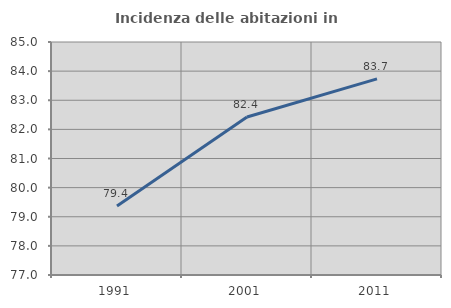
| Category | Incidenza delle abitazioni in proprietà  |
|---|---|
| 1991.0 | 79.369 |
| 2001.0 | 82.425 |
| 2011.0 | 83.733 |